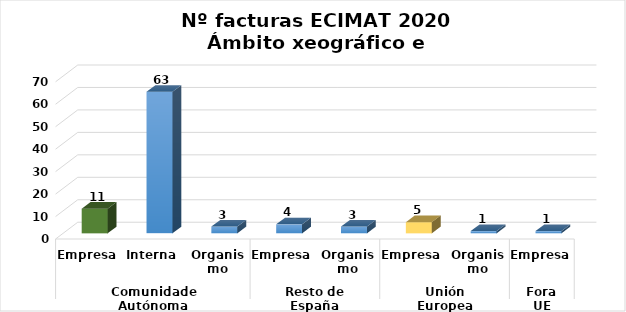
| Category | Series 0 |
|---|---|
| 0 | 11 |
| 1 | 63 |
| 2 | 3 |
| 3 | 4 |
| 4 | 3 |
| 5 | 5 |
| 6 | 1 |
| 7 | 1 |